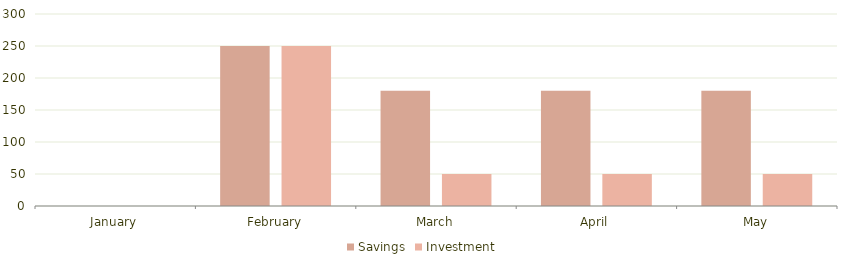
| Category | Savings | Investment |
|---|---|---|
| January | 0 | 0 |
| February | 250 | 250 |
| March | 180 | 50 |
| April | 180 | 50 |
| May | 180 | 50 |